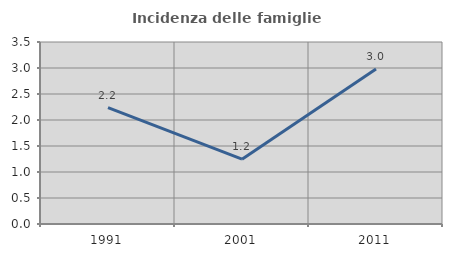
| Category | Incidenza delle famiglie numerose |
|---|---|
| 1991.0 | 2.237 |
| 2001.0 | 1.247 |
| 2011.0 | 2.979 |